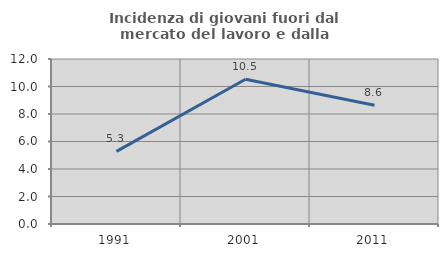
| Category | Incidenza di giovani fuori dal mercato del lavoro e dalla formazione  |
|---|---|
| 1991.0 | 5.281 |
| 2001.0 | 10.526 |
| 2011.0 | 8.636 |